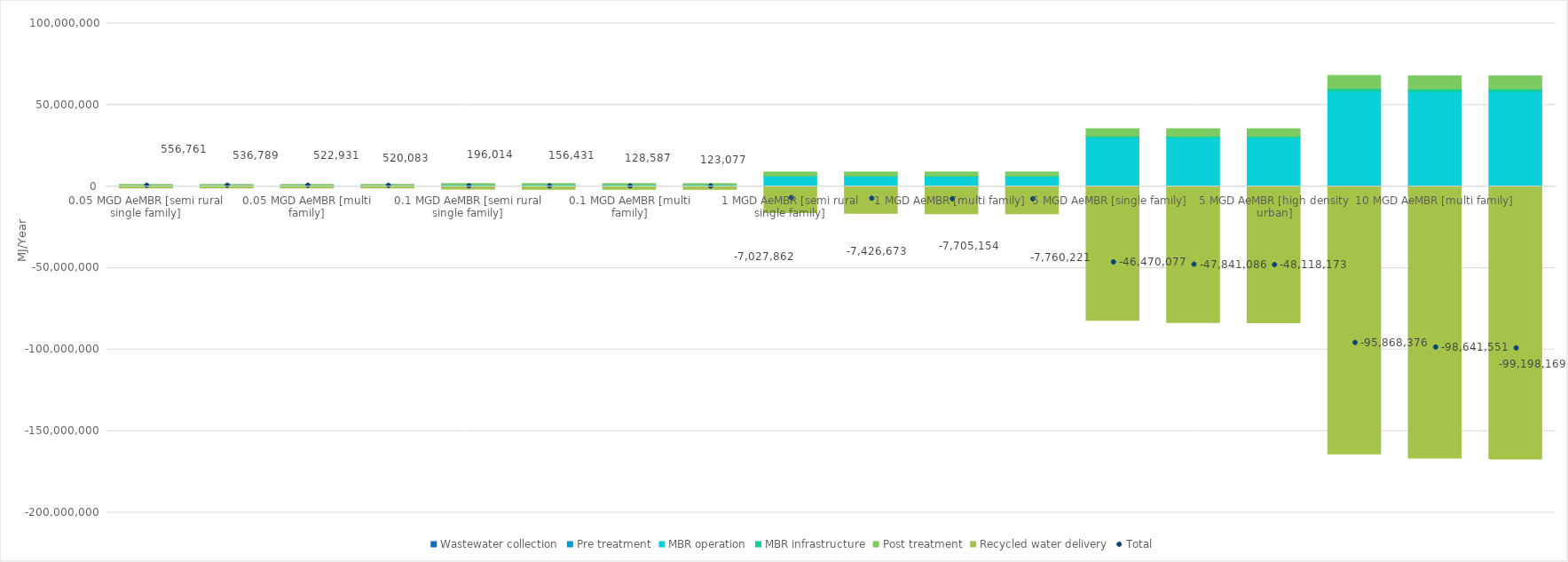
| Category | Wastewater collection | Pre treatment | MBR operation | MBR infrastructure | Post treatment | Recycled water delivery |
|---|---|---|---|---|---|---|
| 0.05 MGD AeMBR [semi rural single family] | 2782.008 | 44914.637 | 764342.2 | 11101 | 534976.397 | -801355.338 |
| 0.05 MGD AeMBR [single family] | 1459.805 | 44914.637 | 764342.2 | 11101 | 534976.397 | -820005.006 |
| 0.05 MGD AeMBR [multi family] | 370.935 | 44914.637 | 764342.2 | 11101 | 534976.397 | -832773.871 |
| 0.05 MGD AeMBR [high density urban] | 174.291 | 44914.637 | 764342.2 | 11101 | 534976.397 | -835425.796 |
| 0.1 MGD AeMBR [semi rural single family] | 5306.809 | 62551.973 | 1068206.473 | 20800.5 | 642002.678 | -1602854.054 |
| 0.1 MGD AeMBR [single family] | 2720.19 | 62551.973 | 1068206.473 | 20800.5 | 642002.678 | -1639850.628 |
| 0.1 MGD AeMBR [multi family] | 741.859 | 62551.973 | 1068206.473 | 20800.5 | 642002.678 | -1665716.114 |
| 0.1 MGD AeMBR [high density urban] | 367.917 | 62551.973 | 1068206.473 | 20800.5 | 642002.678 | -1670852.784 |
| 1 MGD AeMBR [semi rural single family] | 55639.64 | 197955.524 | 6074157.707 | 192694 | 2479824.108 | -16028132.5 |
| 1 MGD AeMBR [single family] | 27201.903 | 197955.524 | 6074157.707 | 192694 | 2479824.108 | -16398506.2 |
| 1 MGD AeMBR [multi family] | 7418.699 | 197955.524 | 6074157.707 | 192694 | 2479824.108 | -16657203.54 |
| 1 MGD AeMBR [high density urban] | 3554.633 | 197955.524 | 6074157.707 | 192694 | 2479824.108 | -16708406.58 |
| 5 MGD AeMBR [single family] | 118177.413 | 482682.128 | 29519148.83 | 859360 | 4545469.192 | -81994914.2 |
| 5 MGD AeMBR [multi family] | 37093.48 | 482682.128 | 29519148.83 | 859360 | 4545469.192 | -83284839.7 |
| 5 MGD AeMBR [high density urban] | 18020.11 | 482682.128 | 29519148.83 | 859360 | 4545469.192 | -83542853.6 |
| 10 MGD AeMBR [single family] | 272019 | 736411.238 | 57388119.111 | 1705070 | 8019323.307 | -163989319 |
| 10 MGD AeMBR [multi family] | 79123.5 | 736411.238 | 57388119.111 | 1705070 | 8019323.307 | -166569598.4 |
| 10 MGD AeMBR [high density urban] | 38416.53 | 736411.238 | 57388119.111 | 1705070 | 8019323.307 | -167085509.5 |